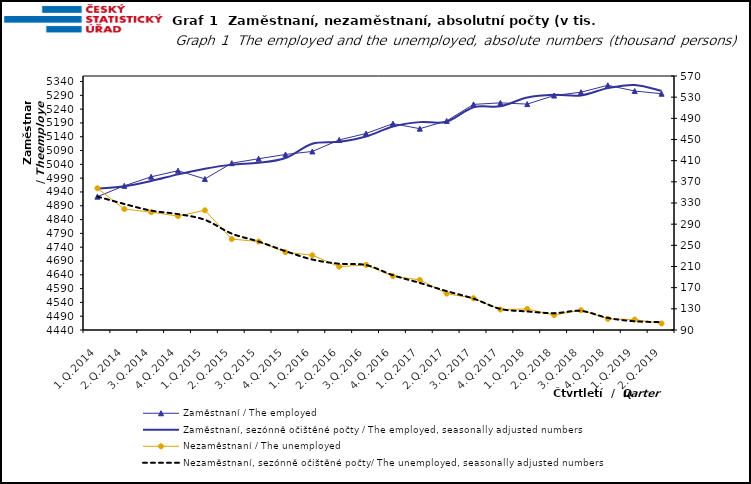
| Category | Zaměstnaní / The employed | Zaměstnaní, sezónně očištěné počty / The employed, seasonally adjusted numbers |
|---|---|---|
| 1.Q.2014 | 4922.963 | 4952.405 |
| 2.Q.2014 | 4962.219 | 4960.65 |
| 3.Q.2014 | 4994.947 | 4979.618 |
| 4.Q.2014 | 5017.051 | 5003.629 |
| 1.Q.2015 | 4987.141 | 5023.827 |
| 2.Q.2015 | 5044.285 | 5038.984 |
| 3.Q.2015 | 5060.3 | 5045.647 |
| 4.Q.2015 | 5075.884 | 5063.085 |
| 1.Q.2016 | 5086.671 | 5114.698 |
| 2.Q.2016 | 5128.493 | 5121.602 |
| 3.Q.2016 | 5151.712 | 5140.967 |
| 4.Q.2016 | 5187.436 | 5177.35 |
| 1.Q.2017 | 5169.203 | 5192.941 |
| 2.Q.2017 | 5197.265 | 5194.555 |
| 3.Q.2017 | 5257.26 | 5246.726 |
| 4.Q.2017 | 5262.691 | 5250.237 |
| 1.Q.2018 | 5258.225 | 5281.99 |
| 2.Q.2018 | 5289.242 | 5291.982 |
| 3.Q.2018 | 5301.361 | 5289.641 |
| 4.Q.2018 | 5326.327 | 5316.128 |
| 1.Q.2019 | 5305.534 | 5327.565 |
| 2.Q.2019 | 5295.929 | 5306.306 |